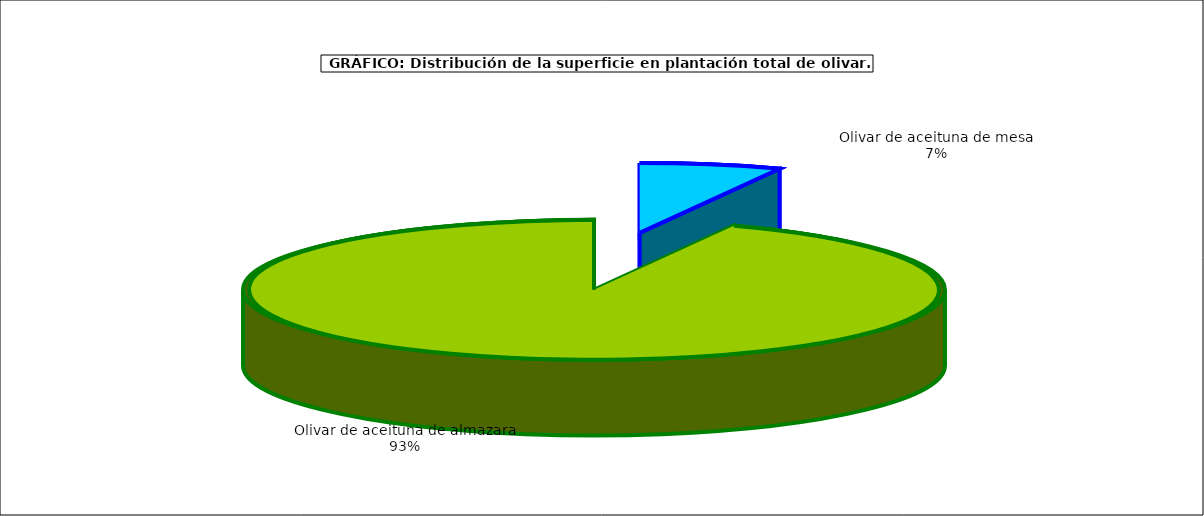
| Category | Series 0 |
|---|---|
|  Olivar de aceituna de mesa  | 171152 |
|  Olivar de aceituna de almazara  | 2452569 |